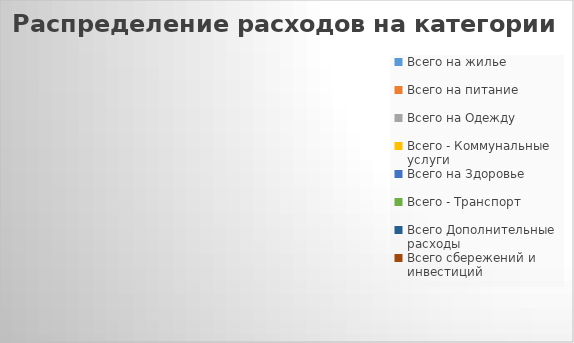
| Category | Series 0 |
|---|---|
| Всего на жилье | 0 |
| Всего на питание | 0 |
| Всего на Одежду | 0 |
| Всего - Коммунальные услуги | 0 |
| Всего на Здоровье | 0 |
| Всего - Транспорт | 0 |
| Всего Дополнительные расходы | 0 |
| Всего сбережений и инвестиций | 0 |